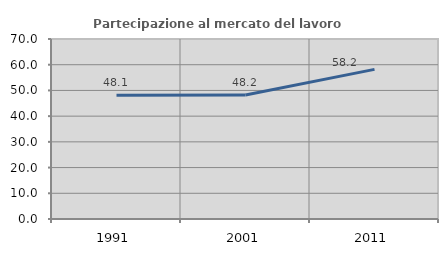
| Category | Partecipazione al mercato del lavoro  femminile |
|---|---|
| 1991.0 | 48.14 |
| 2001.0 | 48.229 |
| 2011.0 | 58.19 |